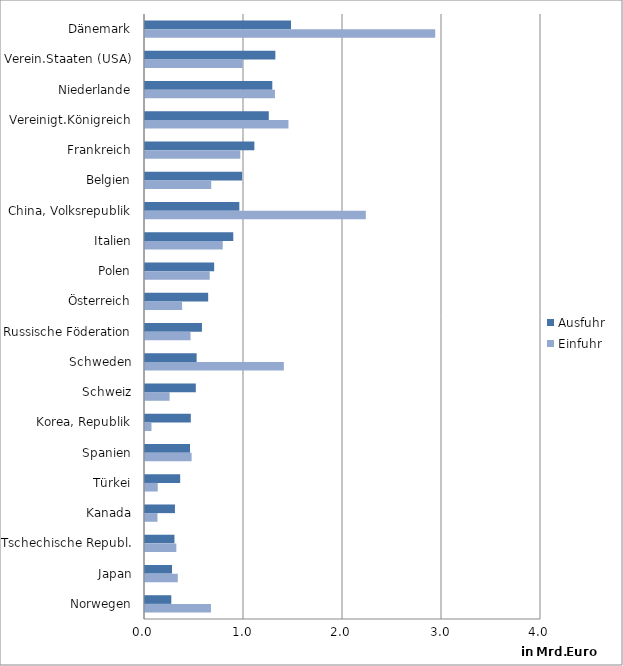
| Category | Ausfuhr | Einfuhr |
|---|---|---|
| Dänemark | 1.475 | 2.932 |
| Verein.Staaten (USA) | 1.317 | 0.986 |
| Niederlande | 1.286 | 1.312 |
| Vereinigt.Königreich | 1.25 | 1.449 |
| Frankreich | 1.105 | 0.963 |
| Belgien | 0.981 | 0.669 |
| China, Volksrepublik | 0.953 | 2.23 |
| Italien | 0.892 | 0.785 |
| Polen | 0.699 | 0.654 |
| Österreich | 0.638 | 0.375 |
| Russische Föderation | 0.575 | 0.46 |
| Schweden | 0.522 | 1.402 |
| Schweiz | 0.513 | 0.248 |
| Korea, Republik | 0.462 | 0.065 |
| Spanien | 0.455 | 0.471 |
| Türkei | 0.355 | 0.129 |
| Kanada | 0.303 | 0.126 |
| Tschechische Republ. | 0.298 | 0.316 |
| Japan | 0.273 | 0.331 |
| Norwegen | 0.266 | 0.666 |